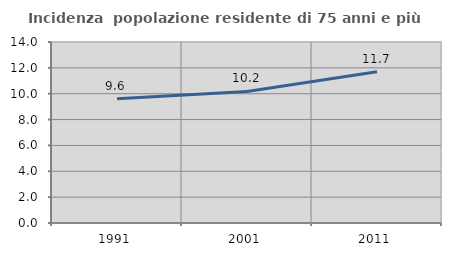
| Category | Incidenza  popolazione residente di 75 anni e più |
|---|---|
| 1991.0 | 9.62 |
| 2001.0 | 10.173 |
| 2011.0 | 11.691 |